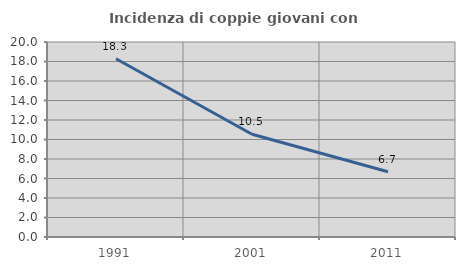
| Category | Incidenza di coppie giovani con figli |
|---|---|
| 1991.0 | 18.276 |
| 2001.0 | 10.535 |
| 2011.0 | 6.694 |